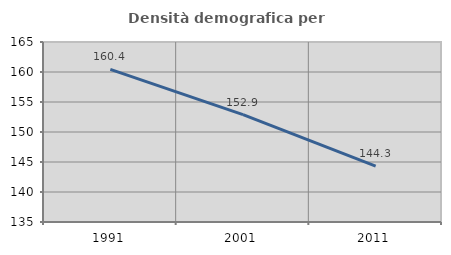
| Category | Densità demografica |
|---|---|
| 1991.0 | 160.425 |
| 2001.0 | 152.901 |
| 2011.0 | 144.327 |